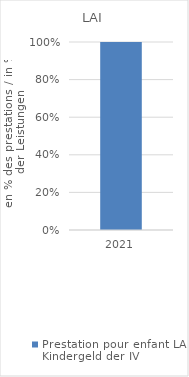
| Category | Prestation pour enfant LAI |
|---|---|
| 2021.0 | 1 |